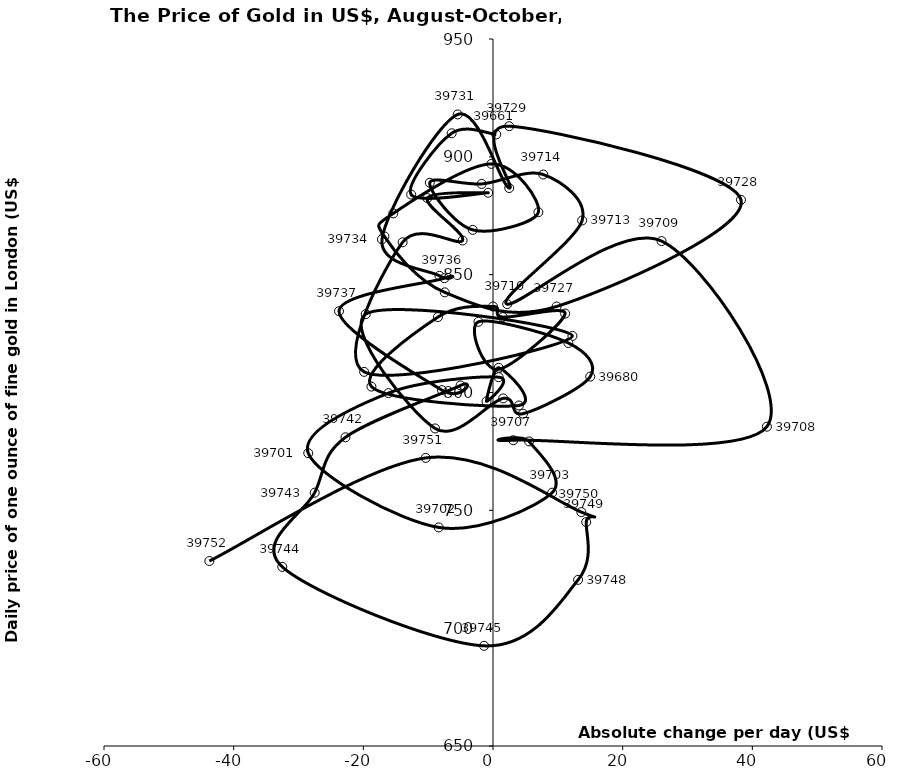
| Category | Series 0 |
|---|---|
| 0.5 | 909.5 |
| -6.375 | 910 |
| -12.625 | 884 |
| -0.75 | 884.75 |
| -10.125 | 882.5 |
| -4.6875 | 864.5 |
| -13.9375 | 863.75 |
| -19.875 | 808.75 |
| 12.25 | 824 |
| -19.625 | 833.25 |
| -8.9375 | 784.75 |
| 1.5625 | 797.5 |
| 4.625 | 791 |
| 15.0 | 806.75 |
| 11.625 | 821 |
| -2.25 | 830 |
| 0.7 | 809.75 |
| 11.125 | 833.5 |
| 1.5 | 832 |
| 0.0 | 836.5 |
| -8.5 | 832 |
| -18.75 | 802.5 |
| 4.0 | 794.5 |
| 0.875 | 810.5 |
| -1.0 | 796.25 |
| 0.875 | 806.5 |
| -16.125 | 799.75 |
| -28.5 | 774.25 |
| -8.375 | 742.75 |
| 9.125 | 757.5 |
| 5.5625 | 779.25 |
| 3.125 | 779.75 |
| 42.25 | 785.5 |
| 26.0 | 864.25 |
| 2.1875 | 837.5 |
| 13.75 | 873 |
| 7.75 | 892.5 |
| -1.75 | 888.5 |
| -9.75 | 889 |
| -3.125 | 869 |
| 7.0 | 876.5 |
| -0.25 | 897 |
| -15.375 | 876 |
| -16.75 | 866.25 |
| -7.4375 | 842.5 |
| 9.8125 | 836.5 |
| 38.25 | 881.75 |
| 2.5 | 913 |
| 2.5 | 886.75 |
| -5.4375 | 918 |
| -17.125 | 865 |
| -8.25 | 849.5 |
| -7.5 | 848.5 |
| -23.75 | 834.5 |
| -7.875 | 801 |
| -5.0 | 803 |
| -22.75 | 781 |
| -27.5 | 757.5 |
| -32.5 | 726 |
| -1.375 | 692.5 |
| 13.125 | 720.5 |
| 14.375 | 745 |
| 13.625 | 749.25 |
| -10.375 | 772.25 |
| -43.75 | 728.5 |